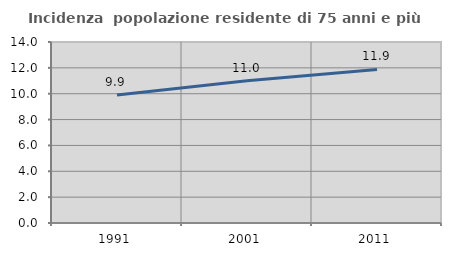
| Category | Incidenza  popolazione residente di 75 anni e più |
|---|---|
| 1991.0 | 9.896 |
| 2001.0 | 10.995 |
| 2011.0 | 11.877 |